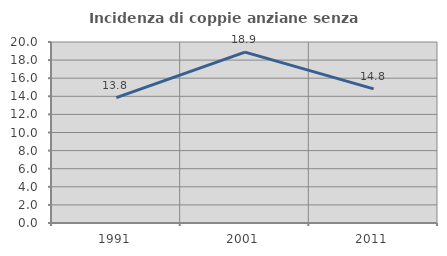
| Category | Incidenza di coppie anziane senza figli  |
|---|---|
| 1991.0 | 13.846 |
| 2001.0 | 18.881 |
| 2011.0 | 14.815 |